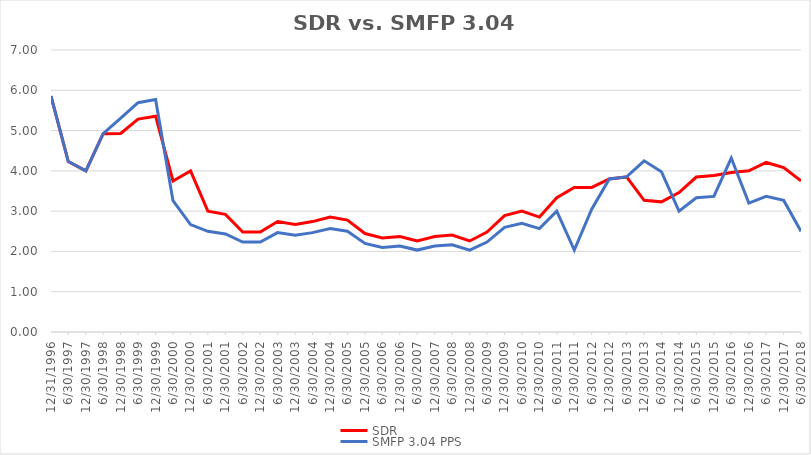
| Category | SDR | SMFP 3.04 PPS |
|---|---|---|
| 12/31/96 | 5.857 | 5.857 |
| 6/30/97 | 4.231 | 4.231 |
| 12/31/97 | 4 | 4 |
| 6/30/98 | 4.923 | 4.923 |
| 12/31/98 | 4.929 | 5.308 |
| 6/30/99 | 5.286 | 5.692 |
| 12/31/99 | 5.357 | 5.769 |
| 6/30/00 | 3.75 | 3.261 |
| 12/31/00 | 4 | 2.667 |
| 6/30/01 | 3 | 2.5 |
| 12/31/01 | 2.92 | 2.433 |
| 6/30/02 | 2.481 | 2.233 |
| 12/31/02 | 2.481 | 2.233 |
| 6/30/03 | 2.741 | 2.467 |
| 12/31/03 | 2.667 | 2.4 |
| 6/30/04 | 2.741 | 2.467 |
| 12/31/04 | 2.852 | 2.567 |
| 6/30/05 | 2.778 | 2.5 |
| 12/31/05 | 2.444 | 2.2 |
| 6/30/06 | 2.333 | 2.1 |
| 12/31/06 | 2.37 | 2.133 |
| 6/30/07 | 2.259 | 2.033 |
| 12/31/07 | 2.37 | 2.133 |
| 6/30/08 | 2.407 | 2.167 |
| 12/31/08 | 2.259 | 2.033 |
| 6/30/09 | 2.481 | 2.233 |
| 12/31/09 | 2.889 | 2.6 |
| 6/30/10 | 3 | 2.7 |
| 12/31/10 | 2.852 | 2.567 |
| 6/30/11 | 3.333 | 3 |
| 12/31/11 | 3.588 | 2.033 |
| 6/30/12 | 3.588 | 3.05 |
| 12/31/12 | 3.8 | 3.8 |
| 6/30/13 | 3.85 | 3.85 |
| 12/31/13 | 3.269 | 4.25 |
| 6/30/14 | 3.231 | 3.979 |
| 12/31/14 | 3.462 | 3 |
| 6/30/15 | 3.846 | 3.333 |
| 12/31/15 | 3.885 | 3.367 |
| 6/30/16 | 3.958 | 4.318 |
| 12/31/16 | 4 | 3.2 |
| 6/30/17 | 4.208 | 3.367 |
| 12/31/17 | 4.083 | 3.267 |
| 6/30/18 | 3.75 | 2.5 |